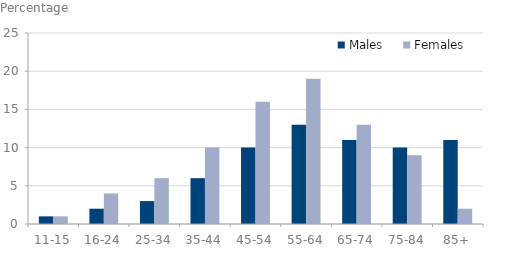
| Category | Males | Females |
|---|---|---|
| 11-15 | 1 | 1 |
| 16-24 | 2 | 4 |
| 25-34 | 3 | 6 |
| 35-44 | 6 | 10 |
| 45-54 | 10 | 16 |
| 55-64 | 13 | 19 |
| 65-74 | 11 | 13 |
| 75-84 | 10 | 9 |
| 85+ | 11 | 2 |